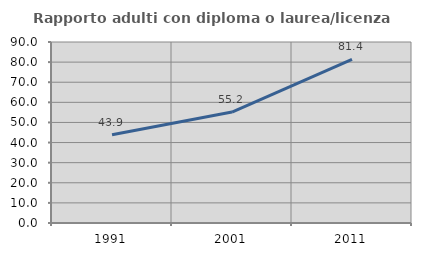
| Category | Rapporto adulti con diploma o laurea/licenza media  |
|---|---|
| 1991.0 | 43.887 |
| 2001.0 | 55.159 |
| 2011.0 | 81.391 |